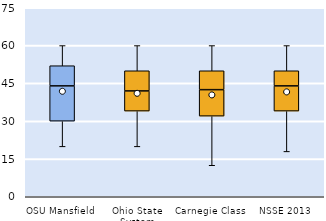
| Category | 25th | 50th | 75th |
|---|---|---|---|
| OSU Mansfield | 30 | 14 | 8 |
| Ohio State System | 34 | 8 | 8 |
| Carnegie Class | 32 | 10.5 | 7.5 |
| NSSE 2013 | 34 | 10 | 6 |